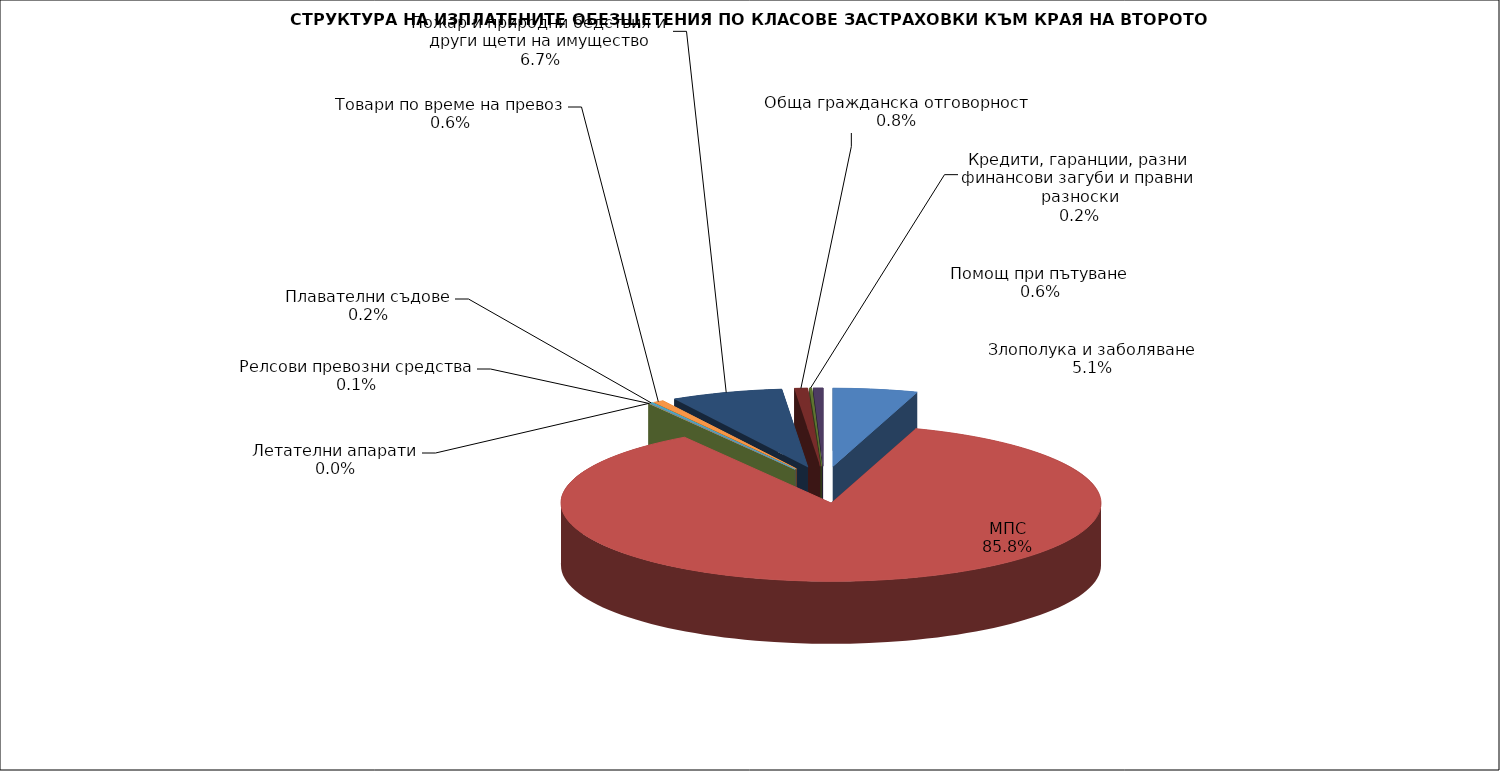
| Category | Злополука и заболяване |
|---|---|
| Злополука и заболяване | 0.051 |
| МПС | 0.858 |
| Релсови превозни средства | 0.001 |
| Летателни апарати | 0 |
| Плавателни съдове | 0.002 |
| Товари по време на превоз | 0.006 |
| Пожар и природни бедствия и други щети на имущество | 0.067 |
| Обща гражданска отговорност | 0.008 |
| Кредити, гаранции, разни финансови загуби и правни разноски | 0.002 |
| Помощ при пътуване | 0.006 |